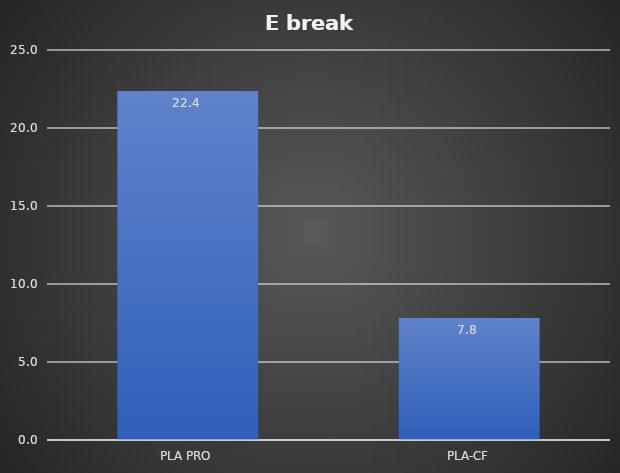
| Category | kJ/m² |
|---|---|
| PLA PRO | 22.379 |
| PLA-CF | 7.817 |